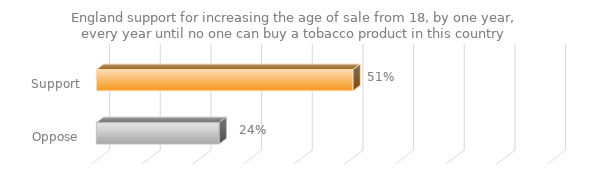
| Category | England support for increasing the age of sale from 18, by one year, every year until no one can buy a tobacco product in this country |
|---|---|
| Support | 0.507 |
| Oppose | 0.242 |